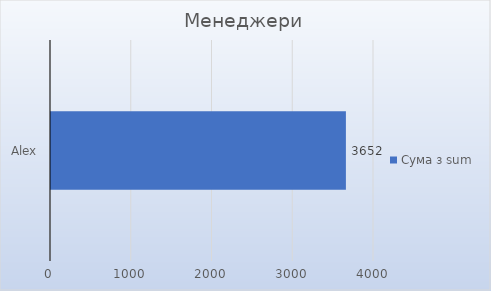
| Category | Підсумок |
|---|---|
| Alex | 3652 |